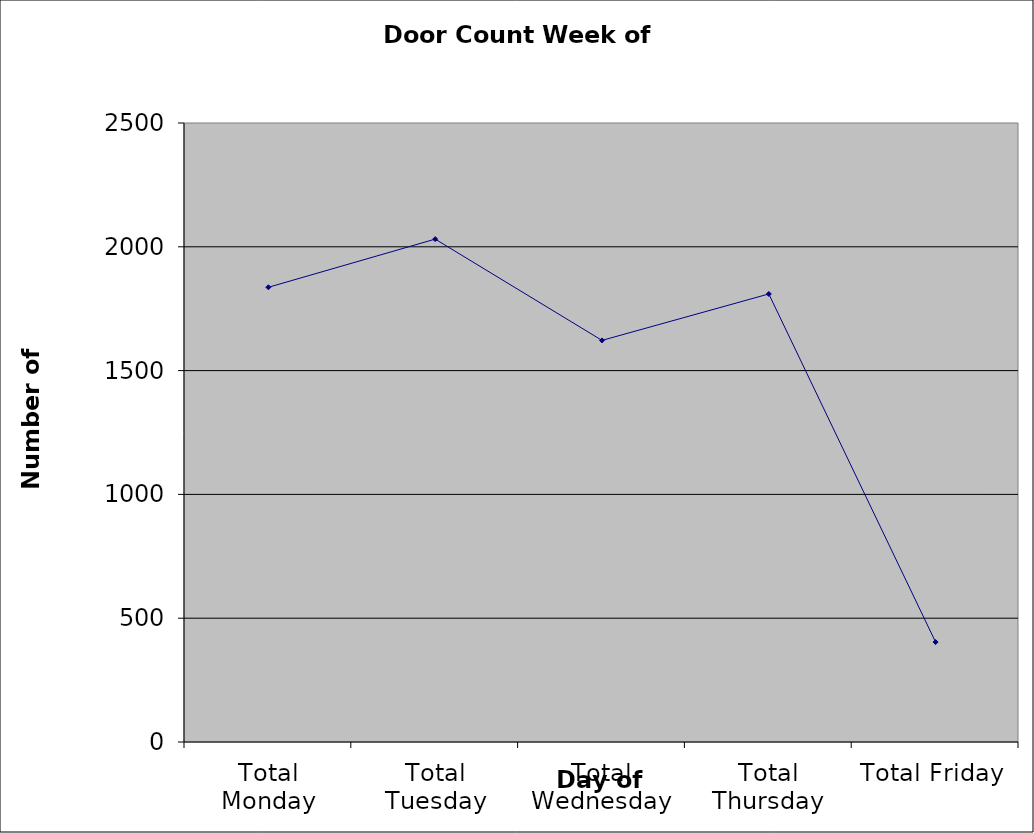
| Category | Series 0 |
|---|---|
| Total Monday | 1836.5 |
| Total Tuesday | 2031 |
| Total Wednesday | 1622 |
| Total Thursday | 1809.5 |
| Total Friday | 403.5 |